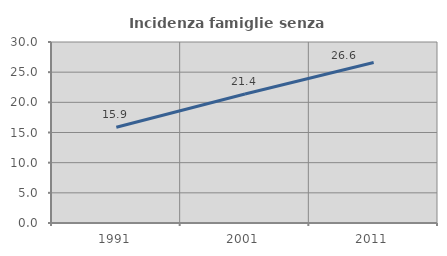
| Category | Incidenza famiglie senza nuclei |
|---|---|
| 1991.0 | 15.865 |
| 2001.0 | 21.387 |
| 2011.0 | 26.589 |